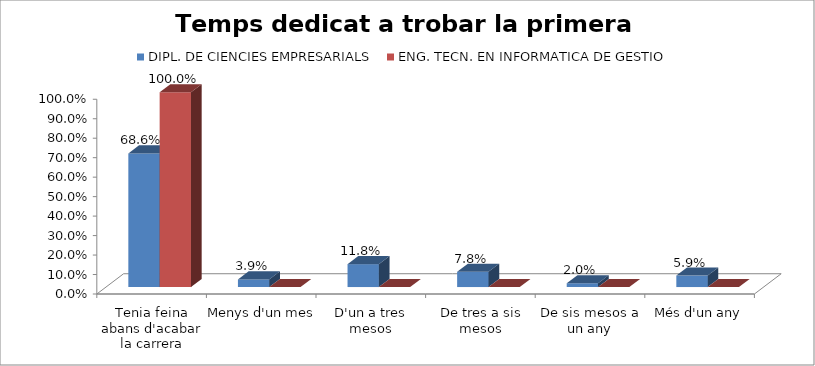
| Category | DIPL. DE CIENCIES EMPRESARIALS | ENG. TECN. EN INFORMATICA DE GESTIO |
|---|---|---|
| Tenia feina abans d'acabar la carrera | 0.686 | 1 |
| Menys d'un mes | 0.039 | 0 |
| D'un a tres mesos | 0.118 | 0 |
| De tres a sis mesos | 0.078 | 0 |
| De sis mesos a un any | 0.02 | 0 |
| Més d'un any | 0.059 | 0 |